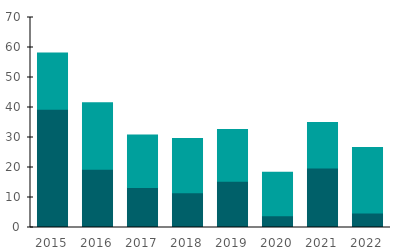
| Category | Herbisidit | Tuhoeläinaineet & Fungisidit |
|---|---|---|
| 2015.0 | 39.4 | 18.8 |
| 2016.0 | 19.4 | 22.2 |
| 2017.0 | 13.3 | 17.5 |
| 2018.0 | 11.6 | 18.1 |
| 2019.0 | 15.4 | 17.3 |
| 2020.0 | 3.9 | 14.5 |
| 2021.0 | 19.8 | 15.2 |
| 2022.0 | 4.8 | 21.9 |